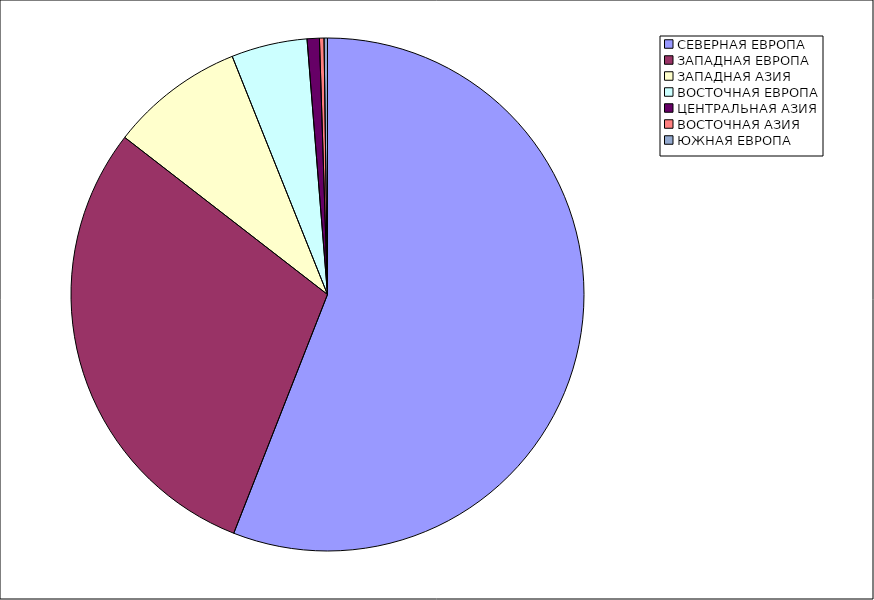
| Category | Оборот |
|---|---|
| СЕВЕРНАЯ ЕВРОПА | 55.954 |
| ЗАПАДНАЯ ЕВРОПА | 29.535 |
| ЗАПАДНАЯ АЗИЯ | 8.452 |
| ВОСТОЧНАЯ ЕВРОПА | 4.784 |
| ЦЕНТРАЛЬНАЯ АЗИЯ | 0.773 |
| ВОСТОЧНАЯ АЗИЯ | 0.285 |
| ЮЖНАЯ ЕВРОПА | 0.216 |